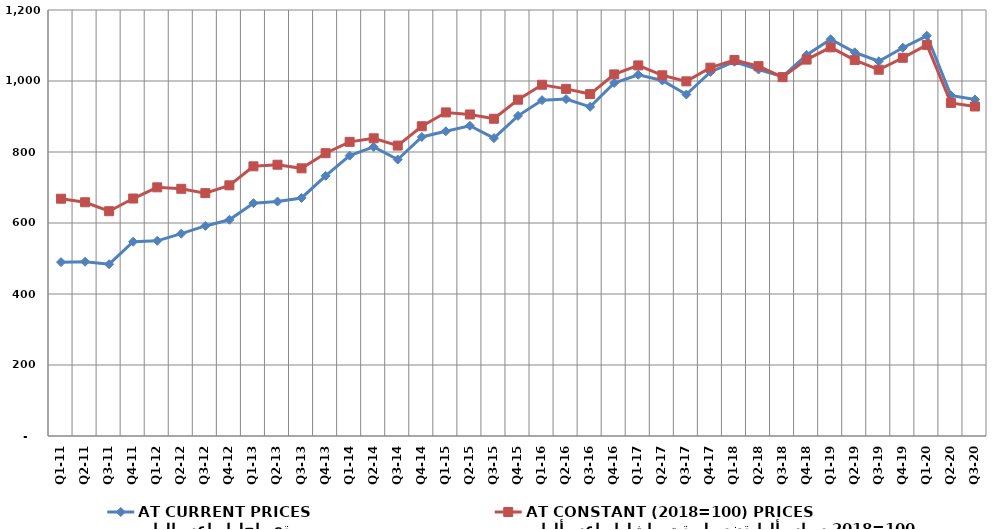
| Category | بالاسعار الجارية
AT CURRENT PRICES | بالأسعار الثابتة لسنة الأساس 2018=100
AT CONSTANT (2018=100) PRICES |
|---|---|---|
| Q1-11 | 489.708 | 668.426 |
| Q2-11 | 490.98 | 658.387 |
| Q3-11 | 483.978 | 633.231 |
| Q4-11 | 547.334 | 668.94 |
| Q1-12 | 549.772 | 700.51 |
| Q2-12 | 569.96 | 696.376 |
| Q3-12 | 591.764 | 684.142 |
| Q4-12 | 609.092 | 706.133 |
| Q1-13 | 655.842 | 759.669 |
| Q2-13 | 660.459 | 764.191 |
| Q3-13 | 670.518 | 754.017 |
| Q4-13 | 732.863 | 796.615 |
| Q1-14 | 789.7 | 828.574 |
| Q2-14 | 814.213 | 838.635 |
| Q3-14 | 778.807 | 818.075 |
| Q4-14 | 842.353 | 872.576 |
| Q1-15 | 858.41 | 911.505 |
| Q2-15 | 873.863 | 905.726 |
| Q3-15 | 839.017 | 893.694 |
| Q4-15 | 901.802 | 947.271 |
| Q1-16 | 945.987 | 989.441 |
| Q2-16 | 948.99 | 977.776 |
| Q3-16 | 927.251 | 963.156 |
| Q4-16 | 994.463 | 1018.58 |
| Q1-17 | 1017.647 | 1043.925 |
| Q2-17 | 1001.468 | 1015.994 |
| Q3-17 | 961.938 | 999.005 |
| Q4-17 | 1025.409 | 1037.57 |
| Q1-18 | 1054.306 | 1059.202 |
| Q2-18 | 1032.359 | 1041.765 |
| Q3-18 | 1012.275 | 1010.919 |
| Q4-18 | 1073.217 | 1060.272 |
| Q1-19 | 1117.572 | 1094.885 |
| Q2-19 | 1080.821 | 1058.88 |
| Q3-19 | 1055.605 | 1031.755 |
| Q4-19 | 1093.744 | 1065.329 |
| Q1-20 | 1127.365 | 1101.588 |
| Q2-20 | 959.52 | 938.314 |
| Q3-20 | 947.942 | 928.172 |